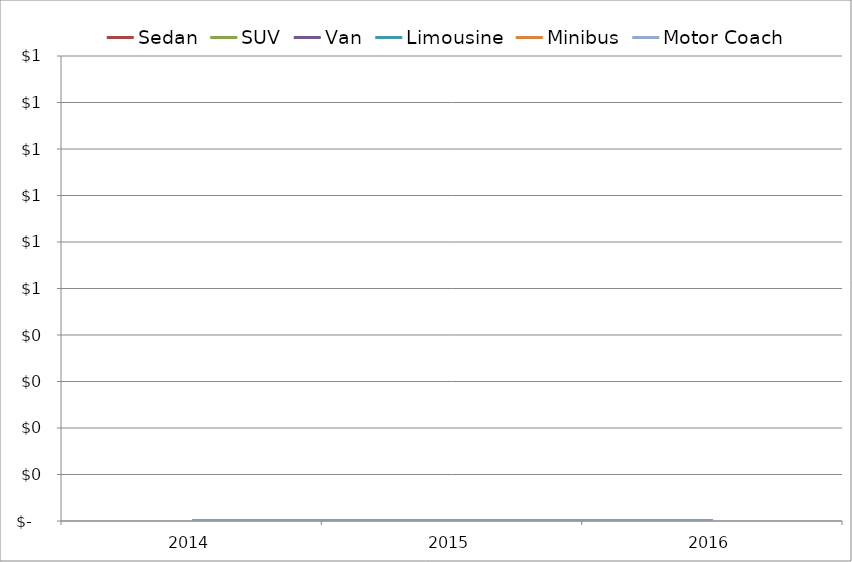
| Category | Sedan | SUV | Van | Limousine | Minibus | Motor Coach |
|---|---|---|---|---|---|---|
| 2014.0 | 0 | 0 | 0 | 0 | 0 | 0 |
| 2015.0 | 0 | 0 | 0 | 0 | 0 | 0 |
| 2016.0 | 0 | 0 | 0 | 0 | 0 | 0 |